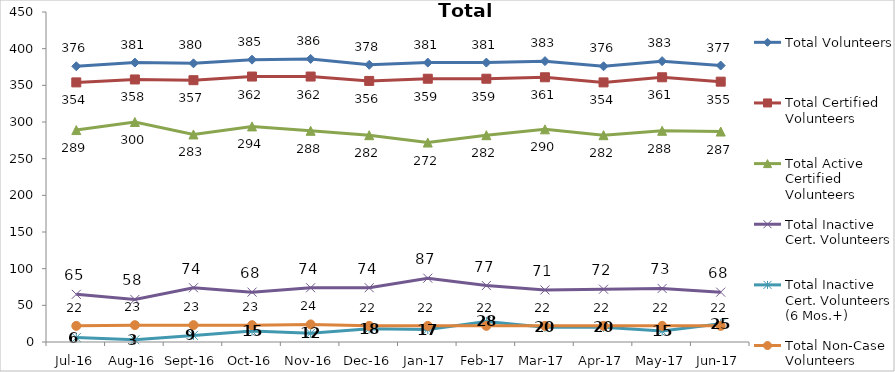
| Category | Total Volunteers | Total Certified Volunteers | Total Active Certified Volunteers | Total Inactive Cert. Volunteers | Total Inactive Cert. Volunteers (6 Mos.+) | Total Non-Case Volunteers |
|---|---|---|---|---|---|---|
| Jul-16 | 376 | 354 | 289 | 65 | 6 | 22 |
| Aug-16 | 381 | 358 | 300 | 58 | 3 | 23 |
| Sep-16 | 380 | 357 | 283 | 74 | 9 | 23 |
| Oct-16 | 385 | 362 | 294 | 68 | 15 | 23 |
| Nov-16 | 386 | 362 | 288 | 74 | 12 | 24 |
| Dec-16 | 378 | 356 | 282 | 74 | 18 | 22 |
| Jan-17 | 381 | 359 | 272 | 87 | 17 | 22 |
| Feb-17 | 381 | 359 | 282 | 77 | 28 | 22 |
| Mar-17 | 383 | 361 | 290 | 71 | 20 | 22 |
| Apr-17 | 376 | 354 | 282 | 72 | 20 | 22 |
| May-17 | 383 | 361 | 288 | 73 | 15 | 22 |
| Jun-17 | 377 | 355 | 287 | 68 | 25 | 22 |